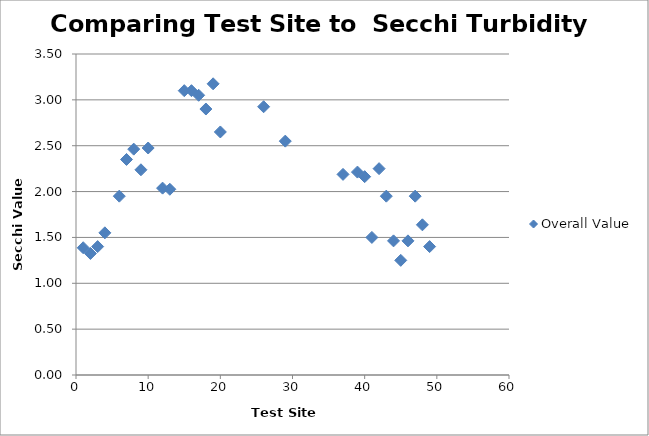
| Category | Overall Value |
|---|---|
| 1.0 | 1.388 |
| 2.0 | 1.325 |
| 3.0 | 1.4 |
| 4.0 | 1.55 |
| 6.0 | 1.95 |
| 7.0 | 2.35 |
| 8.0 | 2.462 |
| 9.0 | 2.238 |
| 10.0 | 2.475 |
| 12.0 | 2.038 |
| 13.0 | 2.025 |
| 15.0 | 3.1 |
| 16.0 | 3.1 |
| 17.0 | 3.05 |
| 18.0 | 2.9 |
| 19.0 | 3.175 |
| 20.0 | 2.65 |
| 26.0 | 2.925 |
| 29.0 | 2.55 |
| 37.0 | 2.188 |
| 39.0 | 2.212 |
| 40.0 | 2.162 |
| 41.0 | 1.5 |
| 42.0 | 2.25 |
| 43.0 | 1.95 |
| 44.0 | 1.462 |
| 45.0 | 1.25 |
| 46.0 | 1.462 |
| 47.0 | 1.95 |
| 48.0 | 1.638 |
| 49.0 | 1.4 |